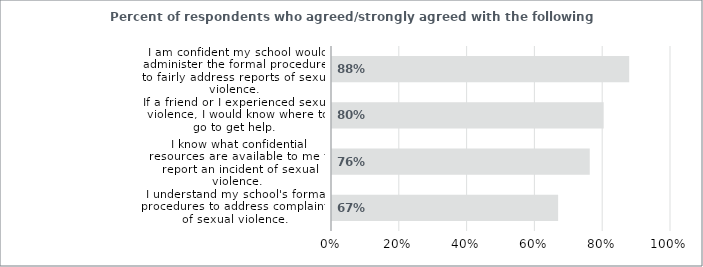
| Category | Percent |
|---|---|
| I understand my school's formal procedures to address complaints of sexual violence. | 0.667 |
| I know what confidential resources are available to me to report an incident of sexual violence. | 0.76 |
| If a friend or I experienced sexual violence, I would know where to go to get help. | 0.801 |
| I am confident my school would administer the formal procedures to fairly address reports of sexual violence. | 0.877 |